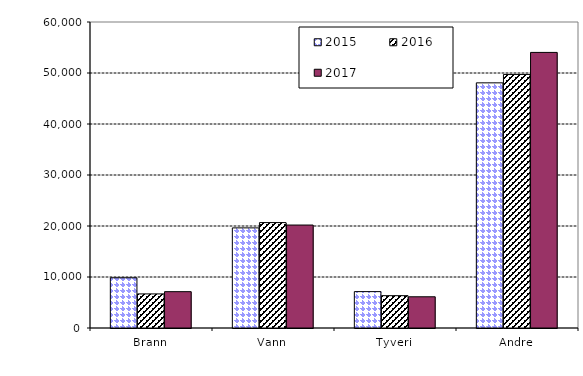
| Category | 2015 | 2016 | 2017 |
|---|---|---|---|
| Brann | 9848 | 6682.536 | 7124.257 |
| Vann | 19630 | 20668.166 | 20188.971 |
| Tyveri | 7135 | 6340.736 | 6121.382 |
| Andre | 48068 | 49716.318 | 54035.703 |